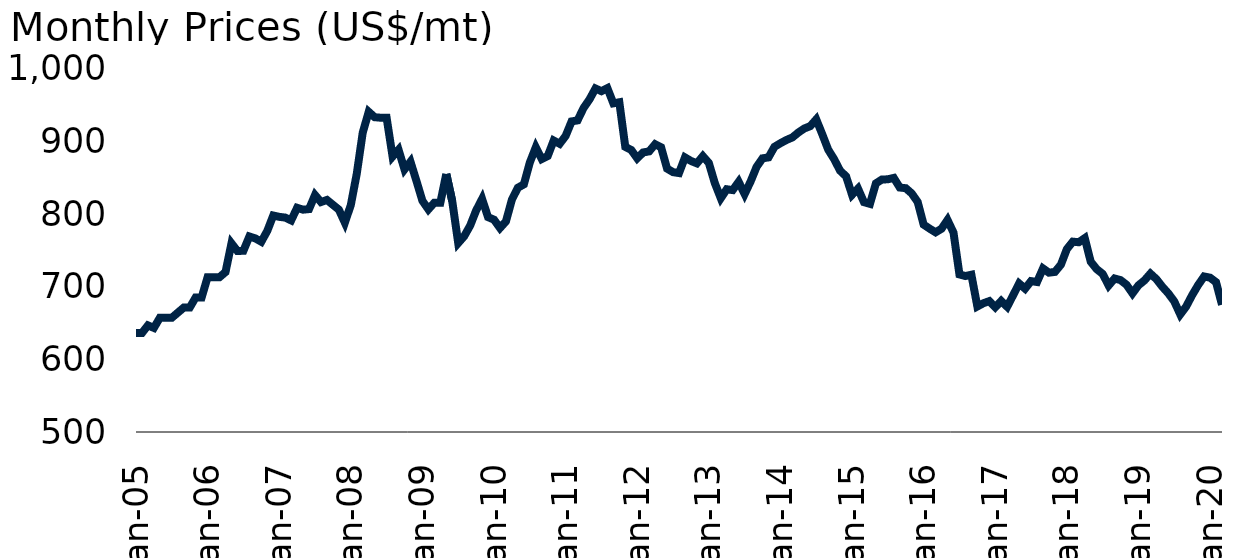
| Category | Sawnwood |
|---|---|
| 2005-01-01 | 636.364 |
| 2005-02-01 | 636.364 |
| 2005-03-01 | 646.853 |
| 2005-04-01 | 643.357 |
| 2005-05-01 | 657.343 |
| 2005-06-01 | 657.343 |
| 2005-07-01 | 657.343 |
| 2005-08-01 | 664.336 |
| 2005-09-01 | 671.329 |
| 2005-10-01 | 671.329 |
| 2005-11-01 | 685.315 |
| 2005-12-01 | 685.315 |
| 2006-01-01 | 713.287 |
| 2006-02-01 | 713.287 |
| 2006-03-01 | 713.287 |
| 2006-04-01 | 720.28 |
| 2006-05-01 | 759.895 |
| 2006-06-01 | 749.267 |
| 2006-07-01 | 749.62 |
| 2006-08-01 | 769.304 |
| 2006-09-01 | 766.662 |
| 2006-10-01 | 762.07 |
| 2006-11-01 | 776.986 |
| 2006-12-01 | 798.177 |
| 2007-01-01 | 796.353 |
| 2007-02-01 | 795.357 |
| 2007-03-01 | 791.455 |
| 2007-04-01 | 808.81 |
| 2007-05-01 | 806.213 |
| 2007-06-01 | 807.062 |
| 2007-07-01 | 826.409 |
| 2007-08-01 | 816.735 |
| 2007-09-01 | 819.621 |
| 2007-10-01 | 812.951 |
| 2007-11-01 | 806.268 |
| 2007-12-01 | 788.329 |
| 2008-01-01 | 812.616 |
| 2008-02-01 | 855.838 |
| 2008-03-01 | 912.455 |
| 2008-04-01 | 940.975 |
| 2008-05-01 | 933.584 |
| 2008-06-01 | 932.886 |
| 2008-07-01 | 932.773 |
| 2008-08-01 | 879.394 |
| 2008-09-01 | 888.755 |
| 2008-10-01 | 861.696 |
| 2008-11-01 | 872.328 |
| 2008-12-01 | 845.8 |
| 2009-01-01 | 818.448 |
| 2009-02-01 | 806.652 |
| 2009-03-01 | 815.856 |
| 2009-04-01 | 815.684 |
| 2009-05-01 | 855.422 |
| 2009-06-01 | 817.9 |
| 2009-07-01 | 760.275 |
| 2009-08-01 | 769.668 |
| 2009-09-01 | 784.272 |
| 2009-10-01 | 805.104 |
| 2009-11-01 | 821.056 |
| 2009-12-01 | 795.956 |
| 2010-01-01 | 792.443 |
| 2010-02-01 | 781 |
| 2010-03-01 | 790.102 |
| 2010-04-01 | 820.208 |
| 2010-05-01 | 836.471 |
| 2010-06-01 | 841.092 |
| 2010-07-01 | 871.183 |
| 2010-08-01 | 892.185 |
| 2010-09-01 | 875.964 |
| 2010-10-01 | 880.174 |
| 2010-11-01 | 901.452 |
| 2010-12-01 | 896.988 |
| 2011-01-01 | 907.782 |
| 2011-02-01 | 927.808 |
| 2011-03-01 | 929.217 |
| 2011-04-01 | 946.209 |
| 2011-05-01 | 958.126 |
| 2011-06-01 | 973.158 |
| 2011-07-01 | 969.42 |
| 2011-08-01 | 973.598 |
| 2011-09-01 | 952.681 |
| 2011-10-01 | 954.176 |
| 2011-11-01 | 892.751 |
| 2011-12-01 | 888.436 |
| 2012-01-01 | 876.999 |
| 2012-02-01 | 885.069 |
| 2012-03-01 | 886.536 |
| 2012-04-01 | 896.381 |
| 2012-05-01 | 892.158 |
| 2012-06-01 | 862.84 |
| 2012-07-01 | 857.918 |
| 2012-08-01 | 856.658 |
| 2012-09-01 | 878.197 |
| 2012-10-01 | 873.362 |
| 2012-11-01 | 870.049 |
| 2012-12-01 | 879.938 |
| 2013-01-01 | 870.594 |
| 2013-02-01 | 842.885 |
| 2013-03-01 | 822.004 |
| 2013-04-01 | 834.368 |
| 2013-05-01 | 833.201 |
| 2013-06-01 | 844.603 |
| 2013-07-01 | 827.703 |
| 2013-08-01 | 845.046 |
| 2013-09-01 | 865.133 |
| 2013-10-01 | 876.956 |
| 2013-11-01 | 878.248 |
| 2013-12-01 | 892.833 |
| 2014-01-01 | 897.778 |
| 2014-02-01 | 902.193 |
| 2014-03-01 | 905.736 |
| 2014-04-01 | 912.494 |
| 2014-05-01 | 918.052 |
| 2014-06-01 | 921.322 |
| 2014-07-01 | 930.588 |
| 2014-08-01 | 910.314 |
| 2014-09-01 | 889.004 |
| 2014-10-01 | 875.76 |
| 2014-11-01 | 859.901 |
| 2014-12-01 | 852.162 |
| 2015-01-01 | 826.71 |
| 2015-02-01 | 835.212 |
| 2015-03-01 | 816.574 |
| 2015-04-01 | 814.23 |
| 2015-05-01 | 842.461 |
| 2015-06-01 | 847.748 |
| 2015-07-01 | 848.074 |
| 2015-08-01 | 849.982 |
| 2015-09-01 | 836.738 |
| 2015-10-01 | 835.812 |
| 2015-11-01 | 828.618 |
| 2015-12-01 | 816.846 |
| 2016-01-01 | 785.618 |
| 2016-02-01 | 780.113 |
| 2016-03-01 | 775.044 |
| 2016-04-01 | 780.004 |
| 2016-05-01 | 792.048 |
| 2016-06-01 | 774.718 |
| 2016-07-01 | 717.056 |
| 2016-08-01 | 714.822 |
| 2016-09-01 | 716.62 |
| 2016-10-01 | 672.912 |
| 2016-11-01 | 677.326 |
| 2016-12-01 | 680.269 |
| 2017-01-01 | 671.822 |
| 2017-02-01 | 680.487 |
| 2017-03-01 | 672.476 |
| 2017-04-01 | 688.444 |
| 2017-05-01 | 704.522 |
| 2017-06-01 | 697.436 |
| 2017-07-01 | 707.846 |
| 2017-08-01 | 706.592 |
| 2017-09-01 | 725.286 |
| 2017-10-01 | 719.454 |
| 2017-11-01 | 720.49 |
| 2017-12-01 | 730.464 |
| 2018-01-01 | 751.936 |
| 2018-02-01 | 762.182 |
| 2018-03-01 | 761.365 |
| 2018-04-01 | 767.033 |
| 2018-05-01 | 734.551 |
| 2018-06-01 | 724.305 |
| 2018-07-01 | 717.765 |
| 2018-08-01 | 701.796 |
| 2018-09-01 | 711.443 |
| 2018-10-01 | 709.208 |
| 2018-11-01 | 702.778 |
| 2018-12-01 | 690.951 |
| 2019-01-01 | 702.069 |
| 2019-02-01 | 708.772 |
| 2019-03-01 | 718.146 |
| 2019-04-01 | 710.626 |
| 2019-05-01 | 700.107 |
| 2019-06-01 | 691.006 |
| 2019-07-01 | 679.888 |
| 2019-08-01 | 661.957 |
| 2019-09-01 | 672.912 |
| 2019-10-01 | 688.553 |
| 2019-11-01 | 702.396 |
| 2019-12-01 | 714.222 |
| 2020-01-01 | 712.588 |
| 2020-02-01 | 706.429 |
| 2020-03-01 | 675.255 |